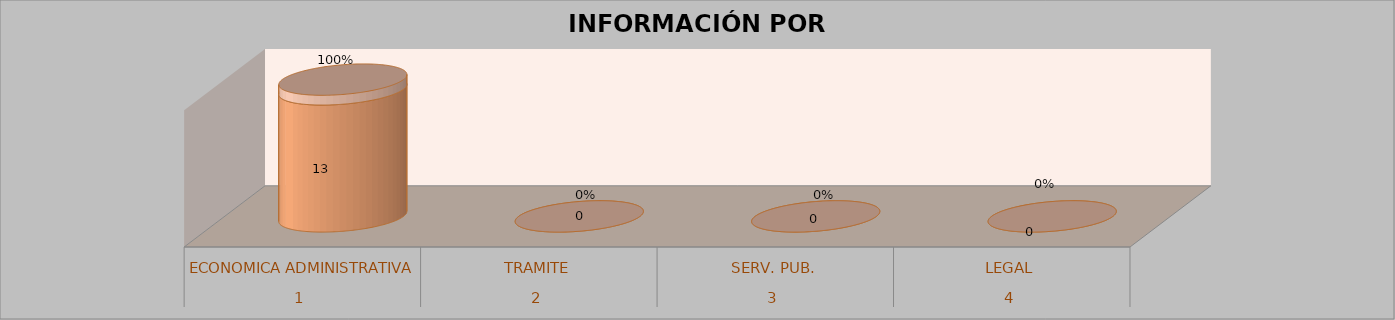
| Category | Series 0 | Series 1 | Series 2 | Series 3 |
|---|---|---|---|---|
| 0 |  |  | 13 | 1 |
| 1 |  |  | 0 | 0 |
| 2 |  |  | 0 | 0 |
| 3 |  |  | 0 | 0 |